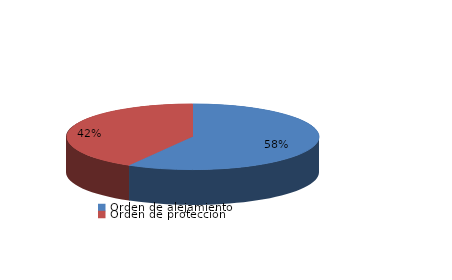
| Category | Series 0 |
|---|---|
| Orden de alejamiento | 21 |
| Orden de protección | 15 |